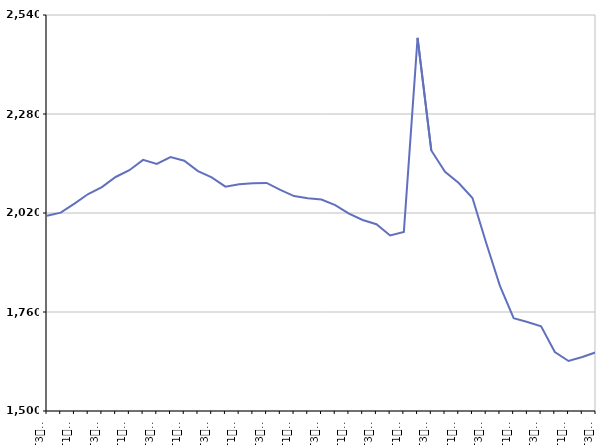
| Category | De 25 à 49 ans |
|---|---|
| T3
2013 | 2012.9 |
| T4
2013 | 2021 |
| T1
2014 | 2044.8 |
| T2
2014 | 2069.8 |
| T3
2014 | 2088.1 |
| T4
2014 | 2114.6 |
| T1
2015 | 2132.4 |
| T2
2015 | 2159.5 |
| T3
2015 | 2148.7 |
| T4
2015 | 2166.8 |
| T1
2016 | 2157.4 |
| T2
2016 | 2130.1 |
| T3
2016 | 2113.4 |
| T4
2016 | 2089.1 |
| T1
2017 | 2095.6 |
| T2
2017 | 2098.3 |
| T3
2017 | 2099 |
| T4
2017 | 2080.9 |
| T1
2018 | 2064.5 |
| T2
2018 | 2058.6 |
| T3
2018 | 2055.4 |
| T4
2018 | 2040.9 |
| T1
2019 | 2018.5 |
| T2
2019 | 2001.7 |
| T3
2019 | 1990.4 |
| T4
2019 | 1960.9 |
| T1
2020 | 1970.5 |
| T2
2020 | 2480 |
| T3
2020 | 2184.1 |
| T4
2020 | 2128.2 |
| T1
2021 | 2098.8 |
| T2
2021 | 2059.4 |
| T3
2021 | 1941.2 |
| T4
2021 | 1828.6 |
| T1
2022 | 1744 |
| T2
2022 | 1733.9 |
| T3
2022 | 1722.3 |
| T4
2022 | 1654.8 |
| T1
2023 | 1631.4 |
| T2
2023 | 1641.8 |
| T3
2023 | 1654.1 |